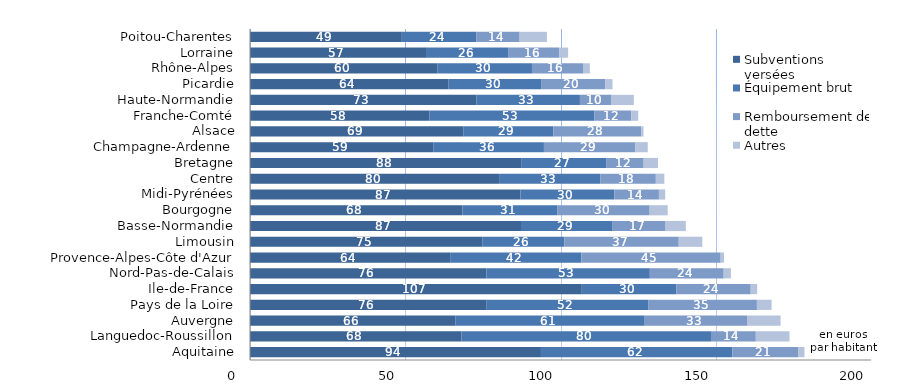
| Category | Subventions versées | Équipement brut | Remboursement de dette | Autres |
|---|---|---|---|---|
| Aquitaine | 93.707 | 61.635 | 21.306 | 1.929 |
| Languedoc-Roussillon | 68.104 | 80.364 | 14.437 | 10.851 |
| Auvergne | 66.221 | 60.906 | 32.94 | 10.81 |
| Pays de la Loire | 76.24 | 51.992 | 35.024 | 4.727 |
| Ile-de-France | 106.863 | 30.403 | 23.995 | 2.08 |
| Nord-Pas-de-Calais | 76.132 | 52.639 | 23.787 | 2.325 |
| Provence-Alpes-Côte d'Azur | 64.457 | 42.26 | 44.873 | 1.07 |
| Limousin | 74.788 | 26.492 | 36.808 | 7.573 |
| Basse-Normandie | 87.277 | 29.337 | 17.243 | 6.506 |
| Bourgogne | 68.401 | 30.666 | 29.653 | 5.798 |
| Midi-Pyrénées | 87.1 | 30.249 | 14.353 | 2.019 |
| Centre | 80.219 | 32.656 | 17.83 | 2.73 |
| Bretagne | 87.516 | 27.17 | 12.097 | 4.61 |
| Champagne-Ardenne | 59.014 | 35.652 | 29.478 | 3.961 |
| Alsace | 68.669 | 29.02 | 28.316 | 0.718 |
| Franche-Comté | 57.742 | 53.205 | 11.883 | 2.21 |
| Haute-Normandie | 72.969 | 33.289 | 10.187 | 7.174 |
| Picardie | 63.975 | 29.954 | 20.449 | 2.368 |
| Rhône-Alpes | 60.433 | 30.376 | 16.442 | 2.202 |
| Lorraine | 56.965 | 26.334 | 16.255 | 2.905 |
| Poitou-Charentes | 48.899 | 23.942 | 14.001 | 8.794 |